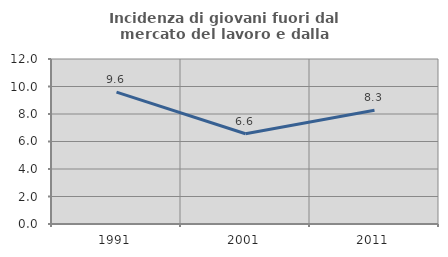
| Category | Incidenza di giovani fuori dal mercato del lavoro e dalla formazione  |
|---|---|
| 1991.0 | 9.589 |
| 2001.0 | 6.565 |
| 2011.0 | 8.269 |